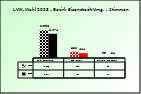
| Category | 2018 | 2023 |
|---|---|---|
| Bgld. Bauernbund | 2386 | 2074 |
| SPÖ Bauern | 552 | 414 |
| Freiheitliche Bauern | 93 | 54 |